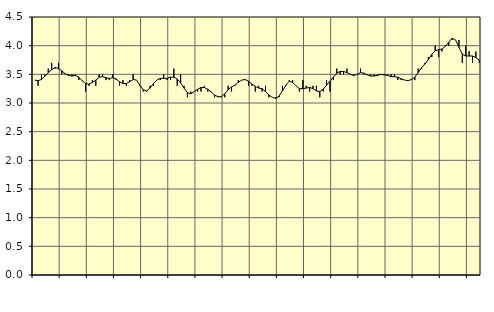
| Category | Piggar | Personliga och kulturella tjänster, SNI 90-98 |
|---|---|---|
| nan | 3.4 | 3.4 |
| 87.0 | 3.3 | 3.39 |
| 87.0 | 3.5 | 3.41 |
| 87.0 | 3.5 | 3.47 |
| nan | 3.6 | 3.53 |
| 88.0 | 3.7 | 3.58 |
| 88.0 | 3.6 | 3.62 |
| 88.0 | 3.7 | 3.6 |
| nan | 3.5 | 3.56 |
| 89.0 | 3.5 | 3.51 |
| 89.0 | 3.5 | 3.48 |
| 89.0 | 3.5 | 3.47 |
| nan | 3.5 | 3.48 |
| 90.0 | 3.4 | 3.45 |
| 90.0 | 3.4 | 3.39 |
| 90.0 | 3.2 | 3.34 |
| nan | 3.3 | 3.33 |
| 91.0 | 3.4 | 3.36 |
| 91.0 | 3.3 | 3.4 |
| 91.0 | 3.5 | 3.45 |
| nan | 3.5 | 3.46 |
| 92.0 | 3.4 | 3.44 |
| 92.0 | 3.4 | 3.43 |
| 92.0 | 3.5 | 3.44 |
| nan | 3.4 | 3.42 |
| 93.0 | 3.3 | 3.37 |
| 93.0 | 3.4 | 3.34 |
| 93.0 | 3.3 | 3.34 |
| nan | 3.4 | 3.37 |
| 94.0 | 3.5 | 3.41 |
| 94.0 | 3.4 | 3.4 |
| 94.0 | 3.3 | 3.31 |
| nan | 3.2 | 3.23 |
| 95.0 | 3.2 | 3.21 |
| 95.0 | 3.3 | 3.26 |
| 95.0 | 3.3 | 3.34 |
| nan | 3.4 | 3.4 |
| 96.0 | 3.4 | 3.43 |
| 96.0 | 3.5 | 3.43 |
| 96.0 | 3.4 | 3.43 |
| nan | 3.4 | 3.45 |
| 97.0 | 3.6 | 3.45 |
| 97.0 | 3.3 | 3.42 |
| 97.0 | 3.5 | 3.35 |
| nan | 3.3 | 3.26 |
| 98.0 | 3.1 | 3.18 |
| 98.0 | 3.2 | 3.16 |
| 98.0 | 3.2 | 3.2 |
| nan | 3.2 | 3.24 |
| 99.0 | 3.2 | 3.27 |
| 99.0 | 3.3 | 3.27 |
| 99.0 | 3.2 | 3.24 |
| nan | 3.2 | 3.19 |
| 0.0 | 3.1 | 3.14 |
| 0.0 | 3.1 | 3.11 |
| 0.0 | 3.1 | 3.11 |
| nan | 3.1 | 3.16 |
| 1.0 | 3.3 | 3.23 |
| 1.0 | 3.2 | 3.28 |
| 1.0 | 3.3 | 3.31 |
| nan | 3.4 | 3.36 |
| 2.0 | 3.4 | 3.4 |
| 2.0 | 3.4 | 3.41 |
| 2.0 | 3.3 | 3.38 |
| nan | 3.3 | 3.33 |
| 3.0 | 3.2 | 3.29 |
| 3.0 | 3.3 | 3.26 |
| 3.0 | 3.2 | 3.25 |
| nan | 3.3 | 3.2 |
| 4.0 | 3.1 | 3.14 |
| 4.0 | 3.1 | 3.1 |
| 4.0 | 3.1 | 3.08 |
| nan | 3.1 | 3.12 |
| 5.0 | 3.3 | 3.21 |
| 5.0 | 3.3 | 3.31 |
| 5.0 | 3.4 | 3.38 |
| nan | 3.4 | 3.36 |
| 6.0 | 3.3 | 3.3 |
| 6.0 | 3.2 | 3.25 |
| 6.0 | 3.4 | 3.25 |
| nan | 3.3 | 3.26 |
| 7.0 | 3.2 | 3.27 |
| 7.0 | 3.3 | 3.25 |
| 7.0 | 3.3 | 3.21 |
| nan | 3.1 | 3.2 |
| 8.0 | 3.2 | 3.24 |
| 8.0 | 3.4 | 3.31 |
| 8.0 | 3.2 | 3.38 |
| nan | 3.4 | 3.45 |
| 9.0 | 3.6 | 3.52 |
| 9.0 | 3.5 | 3.55 |
| 9.0 | 3.5 | 3.55 |
| nan | 3.6 | 3.53 |
| 10.0 | 3.5 | 3.5 |
| 10.0 | 3.5 | 3.48 |
| 10.0 | 3.5 | 3.5 |
| nan | 3.6 | 3.53 |
| 11.0 | 3.5 | 3.52 |
| 11.0 | 3.5 | 3.49 |
| 11.0 | 3.5 | 3.47 |
| nan | 3.5 | 3.47 |
| 12.0 | 3.5 | 3.48 |
| 12.0 | 3.5 | 3.5 |
| 12.0 | 3.5 | 3.49 |
| nan | 3.5 | 3.48 |
| 13.0 | 3.5 | 3.46 |
| 13.0 | 3.5 | 3.46 |
| 13.0 | 3.4 | 3.45 |
| nan | 3.4 | 3.42 |
| 14.0 | 3.4 | 3.4 |
| 14.0 | 3.4 | 3.39 |
| 14.0 | 3.4 | 3.41 |
| nan | 3.4 | 3.45 |
| 15.0 | 3.6 | 3.53 |
| 15.0 | 3.6 | 3.62 |
| 15.0 | 3.7 | 3.68 |
| nan | 3.8 | 3.76 |
| 16.0 | 3.8 | 3.85 |
| 16.0 | 4 | 3.91 |
| 16.0 | 3.8 | 3.93 |
| nan | 3.9 | 3.94 |
| 17.0 | 4 | 3.99 |
| 17.0 | 4 | 4.06 |
| 17.0 | 4.1 | 4.13 |
| nan | 4.1 | 4.1 |
| 18.0 | 4.1 | 3.97 |
| 18.0 | 3.7 | 3.85 |
| 18.0 | 4 | 3.82 |
| nan | 3.9 | 3.82 |
| 19.0 | 3.7 | 3.82 |
| 19.0 | 3.9 | 3.79 |
| 19.0 | 3.7 | 3.75 |